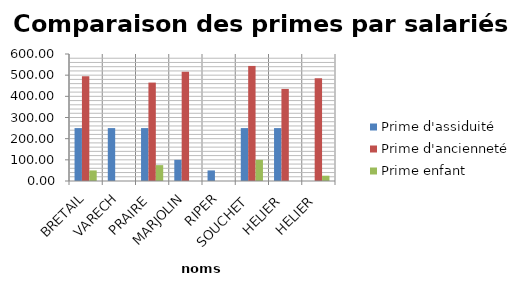
| Category | Prime d'assiduité | Prime d'ancienneté | Prime enfant |
|---|---|---|---|
| BRETAIL | 250 | 495 | 50 |
| VARECH | 250 | 0 | 0 |
| PRAIRE | 250 | 465 | 75 |
| MARJOLIN | 100 | 516 | 0 |
| RIPER | 50 | 0 | 0 |
| SOUCHET | 250 | 543.6 | 100 |
| HELIER | 250 | 435 | 0 |
| HELIER | 0 | 486 | 25 |